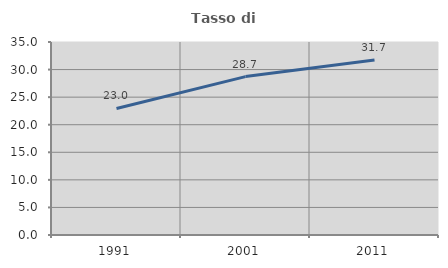
| Category | Tasso di occupazione   |
|---|---|
| 1991.0 | 22.955 |
| 2001.0 | 28.727 |
| 2011.0 | 31.743 |